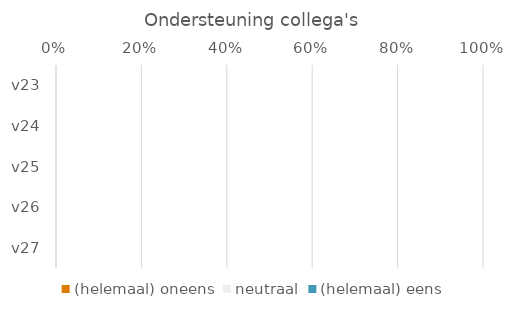
| Category | (helemaal) oneens | neutraal | (helemaal) eens |
|---|---|---|---|
| v23 | 0 | 0 | 0 |
| v24 | 0 | 0 | 0 |
| v25 | 0 | 0 | 0 |
| v26 | 0 | 0 | 0 |
| v27 | 0 | 0 | 0 |